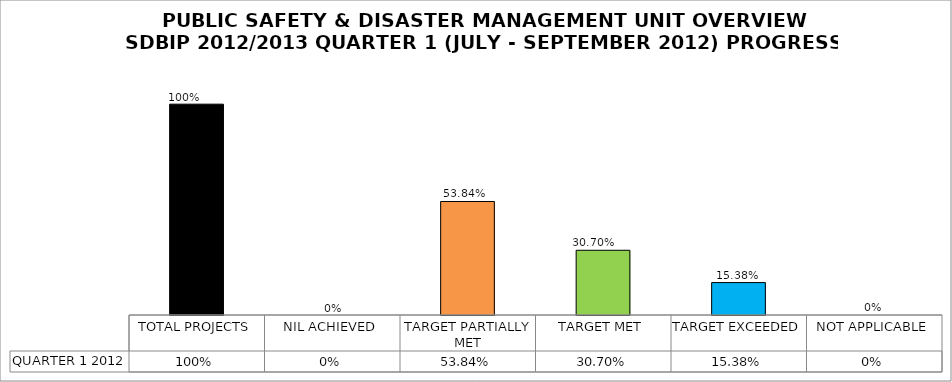
| Category | QUARTER 1 2012 |
|---|---|
| TOTAL PROJECTS | 1 |
| NIL ACHIEVED | 0 |
| TARGET PARTIALLY MET | 0.538 |
| TARGET MET | 0.307 |
| TARGET EXCEEDED | 0.154 |
| NOT APPLICABLE | 0 |